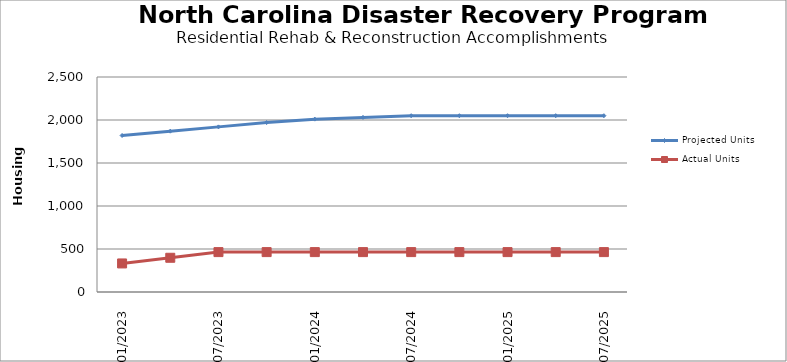
| Category | Projected Units | Actual Units |
|---|---|---|
| 01/2023 | 1820 | 332 |
| 4/2023 | 1870 | 398 |
| 07/2023 | 1920 | 464 |
| 10/2023 | 1970 | 464 |
| 01/2024 | 2010 | 464 |
| 4/2024 | 2030 | 464 |
| 07/2024 | 2050 | 464 |
| 10/2024 | 2050 | 464 |
| 01/2025 | 2050 | 464 |
| 4/2025 | 2050 | 464 |
| 07/2025 | 2050 | 464 |